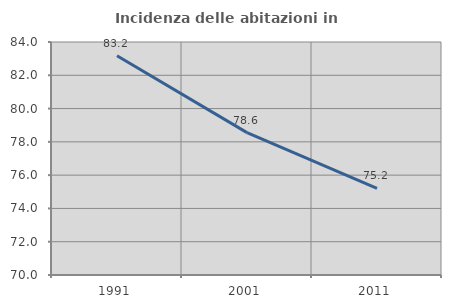
| Category | Incidenza delle abitazioni in proprietà  |
|---|---|
| 1991.0 | 83.173 |
| 2001.0 | 78.555 |
| 2011.0 | 75.211 |